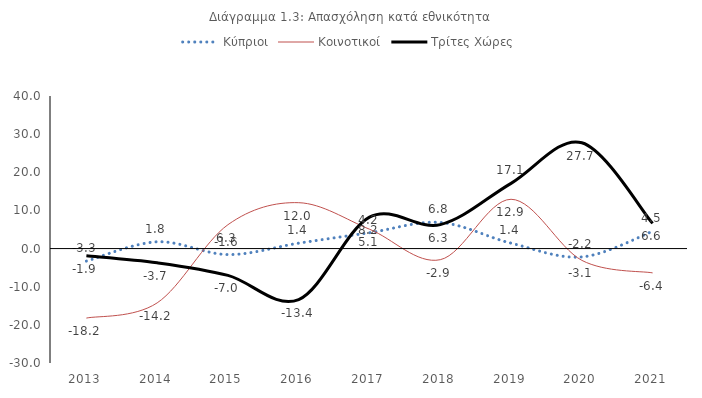
| Category | Κύπριοι | Κοινοτικοί | Τρίτες Χώρες |
|---|---|---|---|
| 2013.0 | -3.29 | -18.222 | -1.88 |
| 2014.0 | 1.775 | -14.237 | -3.719 |
| 2015.0 | -1.572 | 6.259 | -7.033 |
| 2016.0 | 1.417 | 12.032 | -13.366 |
| 2017.0 | 4.157 | 5.075 | 8.24 |
| 2018.0 | 6.843 | -2.918 | 6.279 |
| 2019.0 | 1.42 | 12.921 | 17.102 |
| 2020.0 | -2.196 | -3.089 | 27.743 |
| 2021.0 | 4.512 | -6.373 | 6.604 |